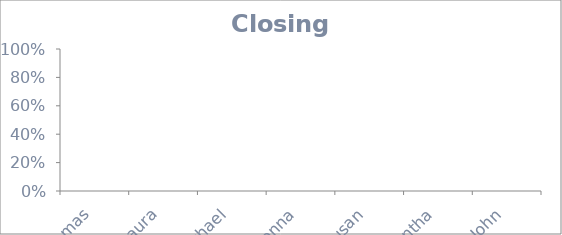
| Category | Closing % |
|---|---|
| Thomas | 1 |
| Laura | 0.75 |
| Michael | 1 |
| Donna | 0.333 |
| Susan | 0 |
| Samantha | 0 |
| John | 0 |